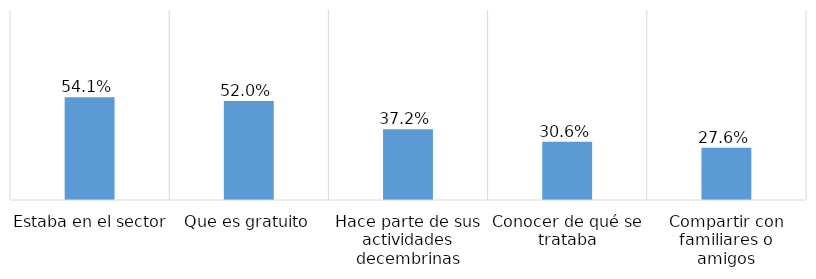
| Category | Series 0 |
|---|---|
| Estaba en el sector  | 0.541 |
| Que es gratuito | 0.52 |
| Hace parte de sus actividades decembrinas | 0.372 |
| Conocer de qué se trataba | 0.306 |
| Compartir con familiares o amigos | 0.276 |